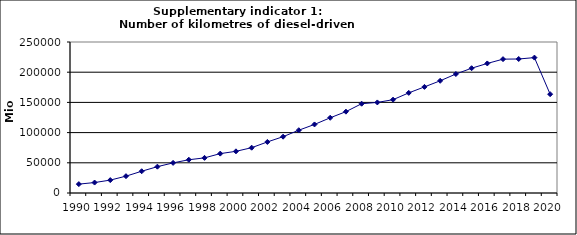
| Category | Number of kilometres of diesel-driven passenger cars, Mio km |
|---|---|
| 1990 | 14717.435 |
| 1991 | 17306.443 |
| 1992 | 21359.321 |
| 1993 | 27866.991 |
| 1994 | 36026.063 |
| 1995 | 43609.619 |
| 1996 | 49869.768 |
| 1997 | 55028.811 |
| 1998 | 58179.786 |
| 1999 | 65198.668 |
| 2000 | 68999.741 |
| 2001 | 75015.534 |
| 2002 | 84524.752 |
| 2003 | 93257.628 |
| 2004 | 103952.55 |
| 2005 | 113495.429 |
| 2006 | 124549.25 |
| 2007 | 134669.603 |
| 2008 | 147824.09 |
| 2009 | 149960.461 |
| 2010 | 154515.443 |
| 2011 | 165790.967 |
| 2012 | 175672.601 |
| 2013 | 185766.901 |
| 2014 | 196985.609 |
| 2015 | 206598.428 |
| 2016 | 214502.568 |
| 2017 | 221598.245 |
| 2018 | 221877.437 |
| 2019 | 224156.801 |
| 2020 | 163606.675 |